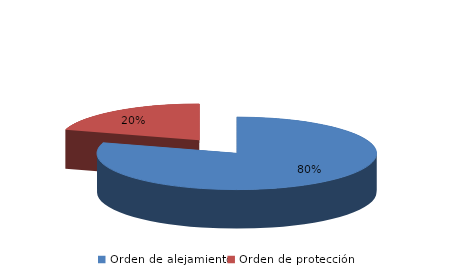
| Category | Series 0 |
|---|---|
| Orden de alejamiento | 161 |
| Orden de protección | 41 |